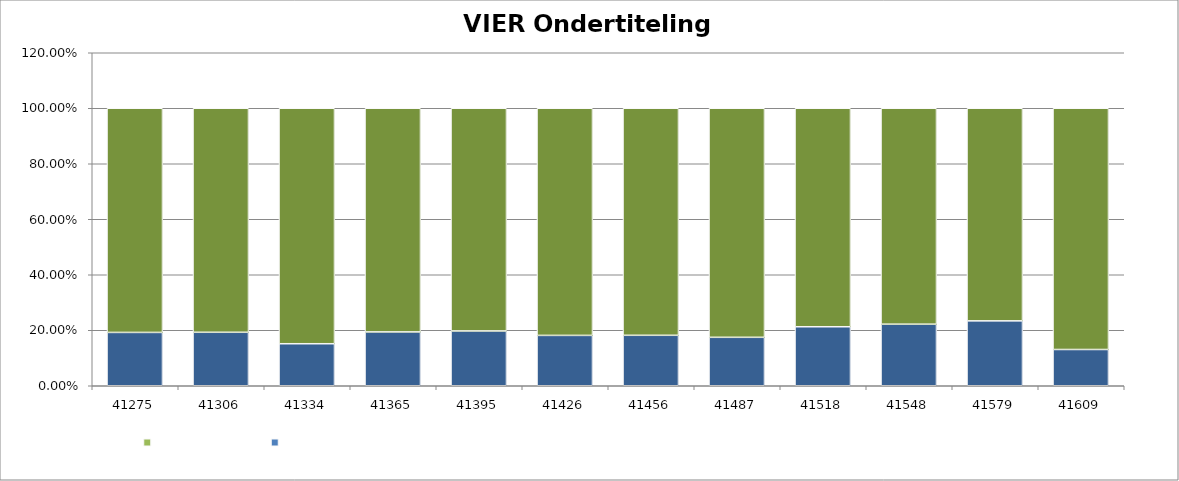
| Category | #VERW! #VERW! | % programma's niet/onvolledig ondertiteld #VERW! | % programma's volledig ondertiteld #VERW! |
|---|---|---|---|
| 41275.0 |  | 0.192 | 0.808 |
| 41306.0 |  | 0.193 | 0.807 |
| 41334.0 |  | 0.151 | 0.849 |
| 41365.0 |  | 0.194 | 0.806 |
| 41395.0 |  | 0.197 | 0.803 |
| 41426.0 |  | 0.182 | 0.818 |
| 41456.0 |  | 0.182 | 0.818 |
| 41487.0 |  | 0.175 | 0.825 |
| 41518.0 |  | 0.213 | 0.787 |
| 41548.0 |  | 0.222 | 0.778 |
| 41579.0 |  | 0.234 | 0.766 |
| 41609.0 |  | 0.131 | 0.869 |